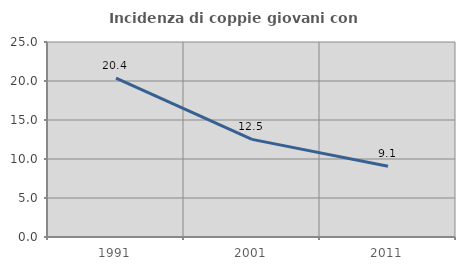
| Category | Incidenza di coppie giovani con figli |
|---|---|
| 1991.0 | 20.367 |
| 2001.0 | 12.52 |
| 2011.0 | 9.078 |